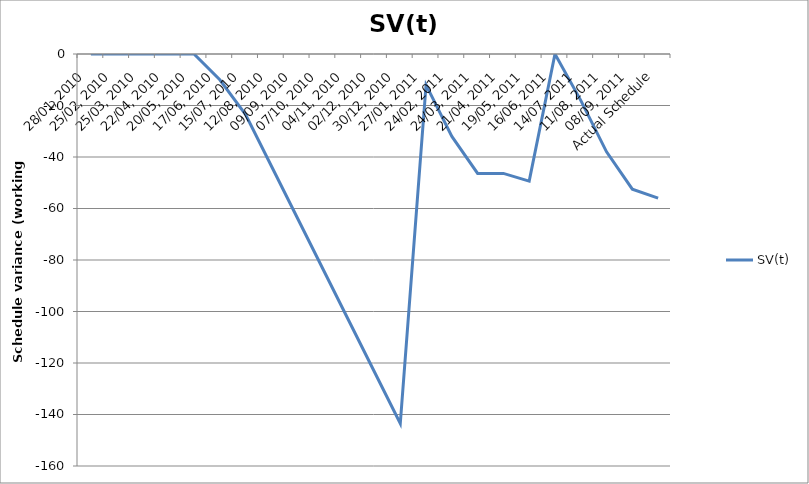
| Category | SV(t) |
|---|---|
| 28/01, 2010 | 0 |
| 25/02, 2010 | 0 |
| 25/03, 2010 | 0 |
| 22/04, 2010 | 0 |
| 20/05, 2010 | 0 |
| 17/06, 2010 | -10 |
| 15/07, 2010 | -23.5 |
| 12/08, 2010 | -43.5 |
| 09/09, 2010 | -63.5 |
| 07/10, 2010 | -83.5 |
| 04/11, 2010 | -103.5 |
| 02/12, 2010 | -123.5 |
| 30/12, 2010 | -143.5 |
| 27/01, 2011 | -12 |
| 24/02, 2011 | -32 |
| 24/03, 2011 | -46.375 |
| 21/04, 2011 | -46.375 |
| 19/05, 2011 | -49.375 |
| 16/06, 2011 | 0 |
| 14/07, 2011 | -18 |
| 11/08, 2011 | -38 |
| 08/09, 2011 | -52.5 |
| Actual Schedule | -56 |